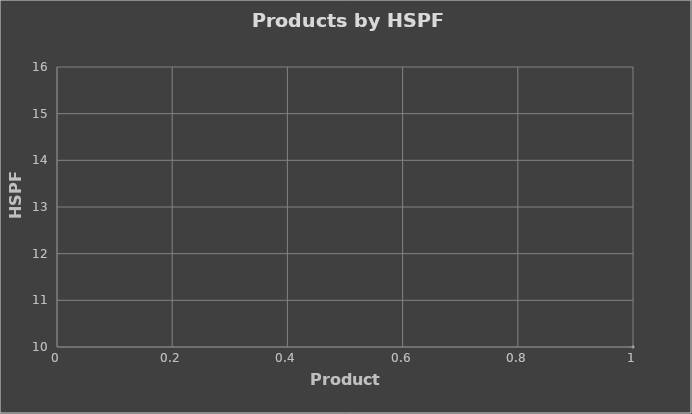
| Category | Series 0 |
|---|---|
| 0 | 10 |
| 1 | 10 |
| 2 | 10 |
| 3 | 10 |
| 4 | 10 |
| 5 | 10 |
| 6 | 10 |
| 7 | 10 |
| 8 | 10 |
| 9 | 10 |
| 10 | 10 |
| 11 | 10 |
| 12 | 10 |
| 13 | 10 |
| 14 | 10 |
| 15 | 10 |
| 16 | 10 |
| 17 | 10 |
| 18 | 10 |
| 19 | 10 |
| 20 | 10 |
| 21 | 10 |
| 22 | 10 |
| 23 | 10 |
| 24 | 10 |
| 25 | 15 |
| 26 | 14 |
| 27 | 12 |
| 28 | 12 |
| 29 | 10.5 |
| 30 | 10 |
| 31 | 10 |
| 32 | 10 |
| 33 | 10 |
| 34 | 12 |
| 35 | 10.5 |
| 36 | 10.5 |
| 37 | 13 |
| 38 | 10.5 |
| 39 | 10.5 |
| 40 | 11.5 |
| 41 | 12 |
| 42 | 11 |
| 43 | 12 |
| 44 | 10.3 |
| 45 | 10.3 |
| 46 | 10.2 |
| 47 | 10.2 |
| 48 | 10 |
| 49 | 10 |
| 50 | 10 |
| 51 | 10.5 |
| 52 | 10.5 |
| 53 | 12 |
| 54 | 10.5 |
| 55 | 10.5 |
| 56 | 13 |
| 57 | 10.5 |
| 58 | 10.5 |
| 59 | 11.5 |
| 60 | 12 |
| 61 | 11 |
| 62 | 12 |
| 63 | 12 |
| 64 | 13 |
| 65 | 12.5 |
| 66 | 13 |
| 67 | 10.5 |
| 68 | 10.5 |
| 69 | 10.3 |
| 70 | 12 |
| 71 | 11.2 |
| 72 | 10.5 |
| 73 | 10.5 |
| 74 | 11 |
| 75 | 12.5 |
| 76 | 10 |
| 77 | 10.3 |
| 78 | 10.3 |
| 79 | 10.3 |
| 80 | 11.2 |
| 81 | 12 |
| 82 | 10.3 |
| 83 | 10.5 |
| 84 | 10.7 |
| 85 | 12.5 |
| 86 | 10.3 |
| 87 | 12.5 |
| 88 | 10 |
| 89 | 10 |
| 90 | 10 |
| 91 | 10 |
| 92 | 10 |
| 93 | 11 |
| 94 | 10.55 |
| 95 | 10 |
| 96 | 12.5 |
| 97 | 12.5 |
| 98 | 11.6 |
| 99 | 11 |
| 100 | 10.6 |
| 101 | 12.5 |
| 102 | 11.3 |
| 103 | 12 |
| 104 | 11.7 |
| 105 | 12.5 |
| 106 | 11.7 |
| 107 | 11.2 |
| 108 | 11 |
| 109 | 10.1 |
| 110 | 10.5 |
| 111 | 10.1 |
| 112 | 10 |
| 113 | 11.2 |
| 114 | 12 |
| 115 | 11.5 |
| 116 | 10.6 |
| 117 | 10.2 |
| 118 | 11 |
| 119 | 11 |
| 120 | 11 |
| 121 | 11 |
| 122 | 10.3 |
| 123 | 10.3 |
| 124 | 10.3 |
| 125 | 11.4 |
| 126 | 11.4 |
| 127 | 12.5 |
| 128 | 12 |
| 129 | 13 |
| 130 | 12.2 |
| 131 | 12.2 |
| 132 | 11.5 |
| 133 | 12.6 |
| 134 | 11.6 |
| 135 | 11.2 |
| 136 | 12.4 |
| 137 | 11.3 |
| 138 | 11 |
| 139 | 14 |
| 140 | 13.4 |
| 141 | 13.8 |
| 142 | 13.3 |
| 143 | 14.2 |
| 144 | 14 |
| 145 | 14.2 |
| 146 | 14 |
| 147 | 14 |
| 148 | 13.8 |
| 149 | 13.4 |
| 150 | 13.3 |
| 151 | 10.5 |
| 152 | 10.4 |
| 153 | 10.5 |
| 154 | 11.8 |
| 155 | 11 |
| 156 | 11 |
| 157 | 10.6 |
| 158 | 10.6 |
| 159 | 10 |
| 160 | 10.5 |
| 161 | 10.5 |
| 162 | 10.3 |
| 163 | 10.3 |
| 164 | 10.2 |
| 165 | 10.4 |
| 166 | 10.5 |
| 167 | 10 |
| 168 | 10 |
| 169 | 10 |
| 170 | 10 |
| 171 | 11.5 |
| 172 | 12 |
| 173 | 11.2 |
| 174 | 11.2 |
| 175 | 12 |
| 176 | 11.5 |
| 177 | 10 |
| 178 | 10 |
| 179 | 10 |
| 180 | 10.5 |
| 181 | 10 |
| 182 | 10 |
| 183 | 10 |
| 184 | 10 |
| 185 | 10 |
| 186 | 10 |
| 187 | 11.2 |
| 188 | 13 |
| 189 | 10.8 |
| 190 | 10.8 |
| 191 | 11 |
| 192 | 11 |
| 193 | 10.4 |
| 194 | 10.4 |
| 195 | 11.5 |
| 196 | 11.5 |
| 197 | 10.5 |
| 198 | 11 |
| 199 | 11 |
| 200 | 10.5 |
| 201 | 10.5 |
| 202 | 10.5 |
| 203 | 10.5 |
| 204 | 10.3 |
| 205 | 10.3 |
| 206 | 10.5 |
| 207 | 10.5 |
| 208 | 10.5 |
| 209 | 10.5 |
| 210 | 10.3 |
| 211 | 11.2 |
| 212 | 10.8 |
| 213 | 12 |
| 214 | 11 |
| 215 | 10.4 |
| 216 | 11.5 |
| 217 | 11.5 |
| 218 | 10.5 |
| 219 | 10 |
| 220 | 10 |
| 221 | 10 |
| 222 | 10.5 |
| 223 | 11 |
| 224 | 15 |
| 225 | 14 |
| 226 | 12 |
| 227 | 12 |
| 228 | 11 |
| 229 | 11.5 |
| 230 | 11.5 |
| 231 | 15 |
| 232 | 12 |
| 233 | 12 |
| 234 | 14 |
| 235 | 11 |
| 236 | 11.5 |
| 237 | 11.5 |
| 238 | 10.5 |
| 239 | 10.5 |
| 240 | 10.5 |
| 241 | 12 |
| 242 | 12 |
| 243 | 15 |
| 244 | 14 |
| 245 | 10 |
| 246 | 10 |
| 247 | 11 |
| 248 | 11 |
| 249 | 10 |
| 250 | 12 |
| 251 | 13 |
| 252 | 12 |
| 253 | 10 |
| 254 | 10.3 |
| 255 | 10.3 |
| 256 | 10.3 |
| 257 | 10.3 |
| 258 | 10.3 |
| 259 | 10.3 |
| 260 | 10.3 |
| 261 | 10.3 |
| 262 | 10.3 |
| 263 | 10.3 |
| 264 | 10.3 |
| 265 | 10.3 |
| 266 | 10.3 |
| 267 | 10.3 |
| 268 | 10.3 |
| 269 | 10.3 |
| 270 | 10.3 |
| 271 | 10.3 |
| 272 | 10.3 |
| 273 | 10.3 |
| 274 | 10.3 |
| 275 | 10 |
| 276 | 10 |
| 277 | 10.4 |
| 278 | 10.5 |
| 279 | 10.5 |
| 280 | 10 |
| 281 | 10 |
| 282 | 10.5 |
| 283 | 10 |
| 284 | 10 |
| 285 | 10 |
| 286 | 11.5 |
| 287 | 12.5 |
| 288 | 12 |
| 289 | 10.6 |
| 290 | 10 |
| 291 | 10.2 |
| 292 | 10 |
| 293 | 10 |
| 294 | 10.1 |
| 295 | 10.2 |
| 296 | 11 |
| 297 | 10.8 |
| 298 | 10.8 |
| 299 | 11 |
| 300 | 11 |
| 301 | 12 |
| 302 | 12 |
| 303 | 12 |
| 304 | 12.5 |
| 305 | 11 |
| 306 | 10 |
| 307 | 10.7 |
| 308 | 11 |
| 309 | 10.5 |
| 310 | 11.5 |
| 311 | 11.5 |
| 312 | 10.5 |
| 313 | 10.75 |
| 314 | 10 |
| 315 | 10 |
| 316 | 11 |
| 317 | 11.3 |
| 318 | 10.7 |
| 319 | 10 |
| 320 | 11.5 |
| 321 | 11.7 |
| 322 | 11.4 |
| 323 | 11 |
| 324 | 10.5 |
| 325 | 11 |
| 326 | 10 |
| 327 | 10.5 |
| 328 | 11 |
| 329 | 10 |
| 330 | 10 |
| 331 | 10 |
| 332 | 11 |
| 333 | 10.4 |
| 334 | 10 |
| 335 | 10 |
| 336 | 10 |
| 337 | 10.5 |
| 338 | 13.5 |
| 339 | 12.5 |
| 340 | 12 |
| 341 | 11.5 |
| 342 | 12.5 |
| 343 | 11 |
| 344 | 10 |
| 345 | 10.1 |
| 346 | 12.8 |
| 347 | 12.5 |
| 348 | 11.7 |
| 349 | 11.2 |
| 350 | 11.2 |
| 351 | 10.4 |
| 352 | 11 |
| 353 | 11.6 |
| 354 | 13.5 |
| 355 | 12.5 |
| 356 | 12 |
| 357 | 12 |
| 358 | 13 |
| 359 | 11.3 |
| 360 | 10.3 |
| 361 | 10 |
| 362 | 10 |
| 363 | 10 |
| 364 | 10 |
| 365 | 10.5 |
| 366 | 11 |
| 367 | 11 |
| 368 | 10 |
| 369 | 14 |
| 370 | 12.5 |
| 371 | 10 |
| 372 | 10 |
| 373 | 12 |
| 374 | 11 |
| 375 | 10 |
| 376 | 10 |
| 377 | 10.5 |
| 378 | 10.1 |
| 379 | 10.4 |
| 380 | 10.5 |
| 381 | 10.1 |
| 382 | 10.4 |
| 383 | 12 |
| 384 | 11.5 |
| 385 | 10.7 |
| 386 | 10.5 |
| 387 | 10 |
| 388 | 10 |
| 389 | 10 |
| 390 | 10 |
| 391 | 10 |
| 392 | 10 |
| 393 | 10 |
| 394 | 10 |
| 395 | 10 |
| 396 | 10 |
| 397 | 10 |
| 398 | 10 |
| 399 | 10 |
| 400 | 10 |
| 401 | 10 |
| 402 | 10 |
| 403 | 10 |
| 404 | 10 |
| 405 | 10 |
| 406 | 10 |
| 407 | 10 |
| 408 | 10 |
| 409 | 10 |
| 410 | 10 |
| 411 | 10 |
| 412 | 10 |
| 413 | 10 |
| 414 | 10 |
| 415 | 10 |
| 416 | 10 |
| 417 | 10 |
| 418 | 10 |
| 419 | 10 |
| 420 | 10 |